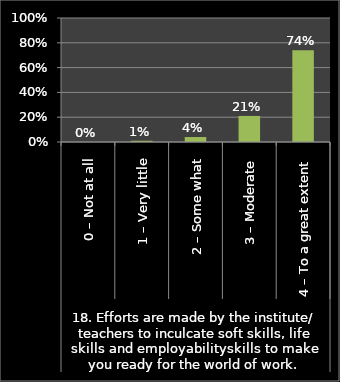
| Category | Series 0 |
|---|---|
| 0 | 0 |
| 1 | 0.01 |
| 2 | 0.04 |
| 3 | 0.21 |
| 4 | 0.74 |